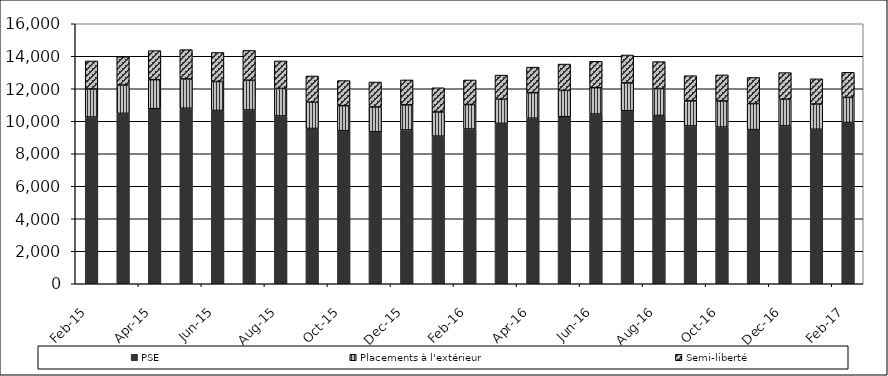
| Category | PSE | Placements à l'extérieur | Semi-liberté |
|---|---|---|---|
| 2015-02-01 | 10261 | 1726 | 1726 |
| 2015-03-01 | 10485 | 1742 | 1742 |
| 2015-04-01 | 10770 | 1789 | 1789 |
| 2015-05-01 | 10801 | 1803 | 1803 |
| 2015-06-01 | 10662 | 1785 | 1785 |
| 2015-07-01 | 10692 | 1832 | 1832 |
| 2015-08-01 | 10325 | 1694 | 1694 |
| 2015-09-01 | 9555 | 1616 | 1616 |
| 2015-10-01 | 9420 | 1542 | 1542 |
| 2015-11-01 | 9350 | 1533 | 1533 |
| 2015-12-01 | 9466 | 1539 | 1539 |
| 2016-01-01 | 9081 | 1490 | 1490 |
| 2016-02-01 | 9521 | 1510 | 1510 |
| 2016-03-01 | 9868 | 1486 | 1486 |
| 2016-04-01 | 10187 | 1572 | 1572 |
| 2016-05-01 | 10278 | 1621 | 1621 |
| 2016-06-01 | 10441 | 1625 | 1625 |
| 2016-07-01 | 10642 | 1718 | 1718 |
| 2016-08-01 | 10355 | 1658 | 1658 |
| 2016-09-01 | 9712 | 1546 | 1546 |
| 2016-10-01 | 9640 | 1607 | 1607 |
| 2016-11-01 | 9484 | 1605 | 1605 |
| 2016-12-01 | 9714 | 1641 | 1641 |
| 2017-01-01 | 9505 | 1553 | 1553 |
| 2017-02-01 | 9927 | 1542 | 1542 |